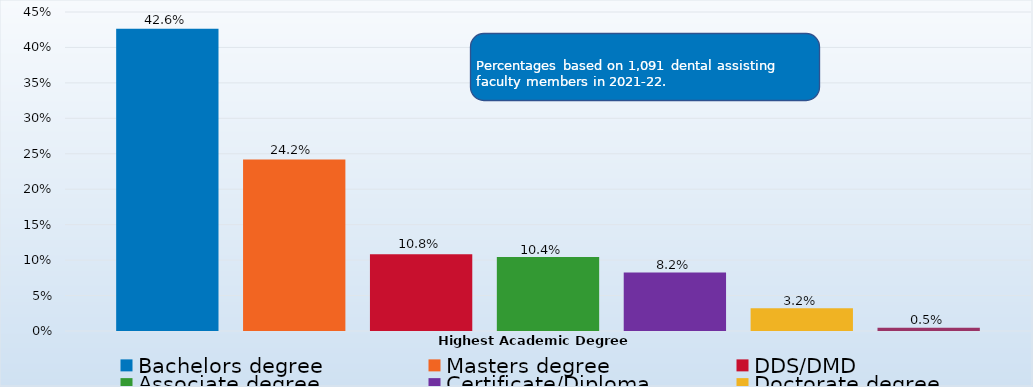
| Category | Bachelors degree | Masters degree | DDS/DMD | Associate degree | Certificate/Diploma | Doctorate degree | Other |
|---|---|---|---|---|---|---|---|
| Percent | 0.426 | 0.242 | 0.108 | 0.104 | 0.082 | 0.032 | 0.005 |